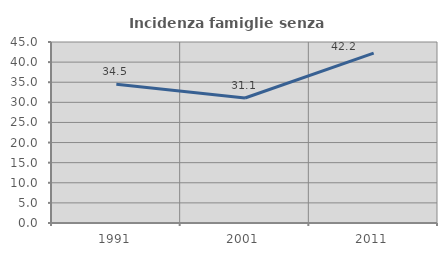
| Category | Incidenza famiglie senza nuclei |
|---|---|
| 1991.0 | 34.483 |
| 2001.0 | 31.068 |
| 2011.0 | 42.241 |